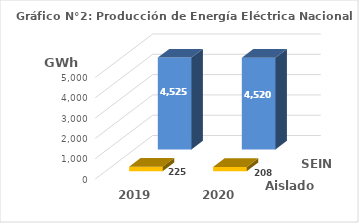
| Category | Aislados | SEIN |
|---|---|---|
| 2019.0 | 224.6 | 4524.867 |
| 2020.0 | 207.674 | 4519.685 |